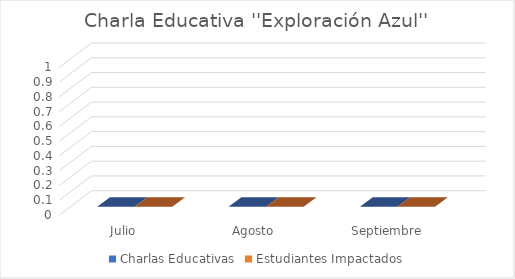
| Category | Charlas Educativas | Estudiantes Impactados |
|---|---|---|
| Julio | 0 | 0 |
| Agosto  | 0 | 0 |
| Septiembre | 0 | 0 |